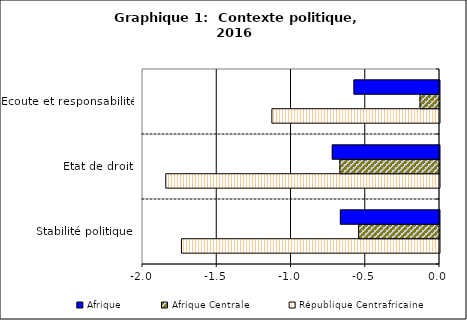
| Category | République Centrafricaine | Afrique Centrale | Afrique |
|---|---|---|---|
| Stabilité politique | -1.738 | -0.544 | -0.667 |
| Etat de droit | -1.843 | -0.671 | -0.722 |
| Ecoute et responsabilité | -1.129 | -0.131 | -0.576 |